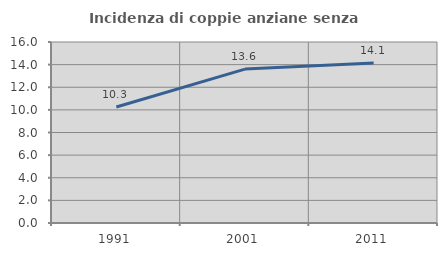
| Category | Incidenza di coppie anziane senza figli  |
|---|---|
| 1991.0 | 10.259 |
| 2001.0 | 13.607 |
| 2011.0 | 14.147 |